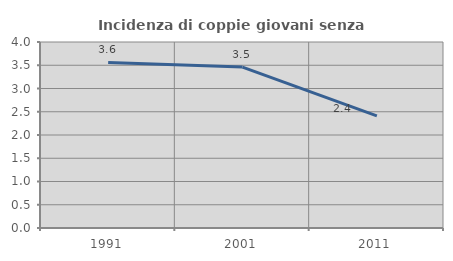
| Category | Incidenza di coppie giovani senza figli |
|---|---|
| 1991.0 | 3.562 |
| 2001.0 | 3.46 |
| 2011.0 | 2.41 |